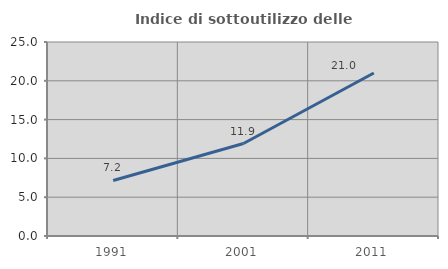
| Category | Indice di sottoutilizzo delle abitazioni  |
|---|---|
| 1991.0 | 7.152 |
| 2001.0 | 11.92 |
| 2011.0 | 21.008 |